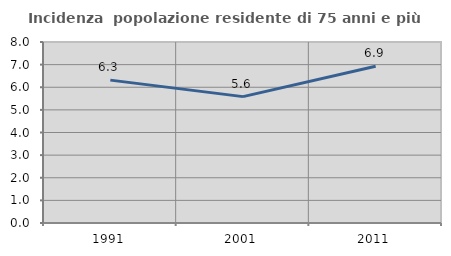
| Category | Incidenza  popolazione residente di 75 anni e più |
|---|---|
| 1991.0 | 6.314 |
| 2001.0 | 5.586 |
| 2011.0 | 6.926 |